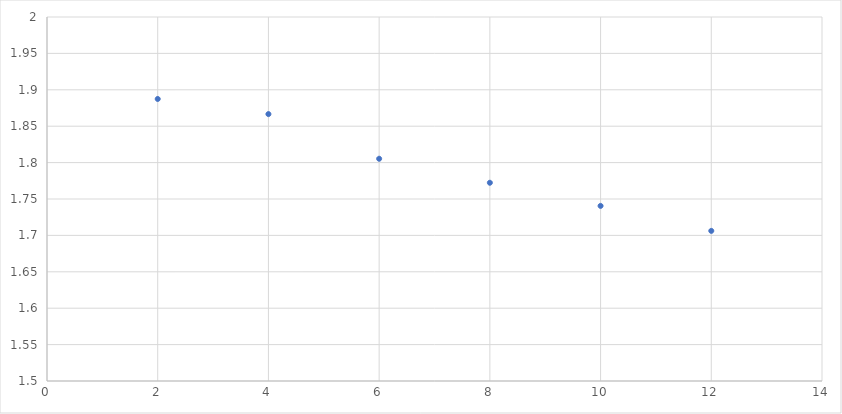
| Category | Series 0 |
|---|---|
| 2.0 | 1.887 |
| 4.0 | 1.867 |
| 6.0 | 1.805 |
| 8.0 | 1.772 |
| 10.0 | 1.741 |
| 12.0 | 1.706 |